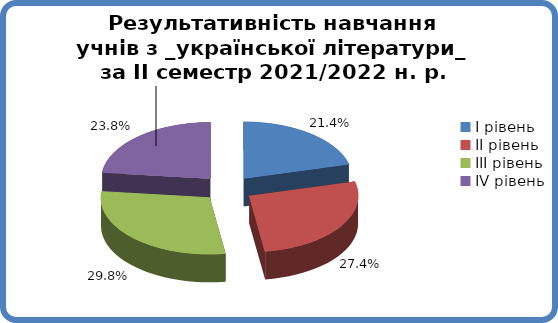
| Category | Series 0 |
|---|---|
| 0 | 0.214 |
| 1 | 0.274 |
| 2 | 0.298 |
| 3 | 0.238 |